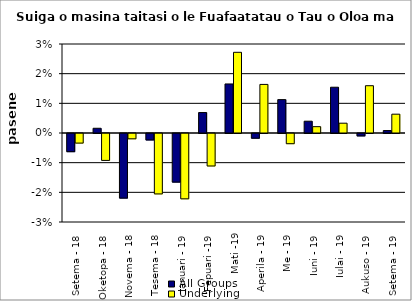
| Category | All Groups | Underlying |
|---|---|---|
| Setema - 18 | -0.006 | -0.003 |
| Oketopa - 18 | 0.002 | -0.009 |
| Novema - 18 | -0.022 | -0.002 |
| Tesema - 18 | -0.002 | -0.02 |
| Ianuari - 19 | -0.016 | -0.022 |
| Fepuari -19 | 0.007 | -0.011 |
| Mati -19 | 0.017 | 0.027 |
| Aperila - 19 | -0.002 | 0.016 |
| Me - 19 | 0.011 | -0.003 |
| Iuni - 19 | 0.004 | 0.002 |
| Iulai - 19 | 0.015 | 0.003 |
| Aukuso - 19 | -0.001 | 0.016 |
| Setema - 19 | 0.001 | 0.006 |